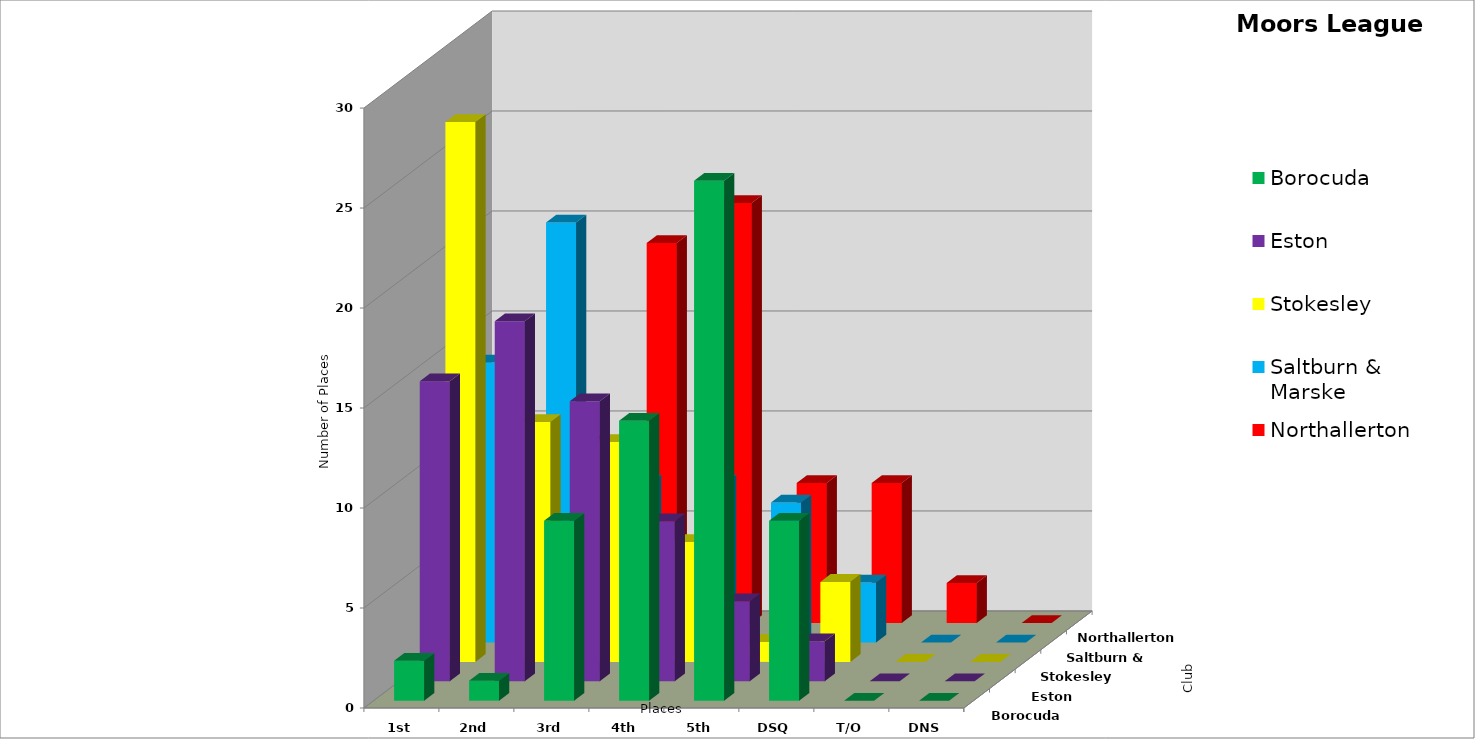
| Category | Borocuda | Eston | Stokesley | Saltburn & Marske | Northallerton |
|---|---|---|---|---|---|
| 1st | 2 | 15 | 27 | 14 | 3 |
| 2nd | 1 | 18 | 12 | 21 | 9 |
| 3rd | 9 | 14 | 11 | 8 | 19 |
| 4th | 14 | 8 | 6 | 8 | 21 |
| 5th | 26 | 4 | 1 | 7 | 7 |
| DSQ | 9 | 2 | 4 | 3 | 7 |
| T/O | 0 | 0 | 0 | 0 | 2 |
| DNS | 0 | 0 | 0 | 0 | 0 |